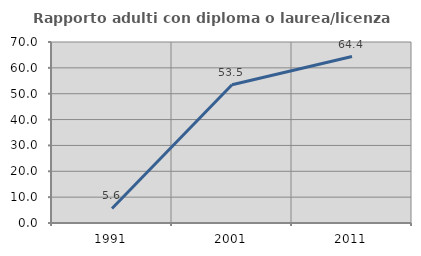
| Category | Rapporto adulti con diploma o laurea/licenza media  |
|---|---|
| 1991.0 | 5.625 |
| 2001.0 | 53.456 |
| 2011.0 | 64.372 |